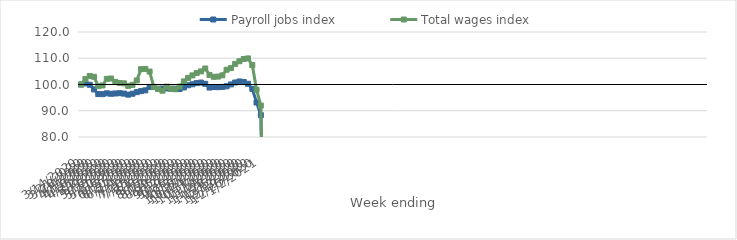
| Category | Payroll jobs index | Total wages index |
|---|---|---|
| 14/03/2020 | 100 | 100 |
| 21/03/2020 | 100.428 | 102.064 |
| 28/03/2020 | 99.907 | 103.228 |
| 04/04/2020 | 98.143 | 102.945 |
| 11/04/2020 | 96.362 | 99.372 |
| 18/04/2020 | 96.324 | 99.639 |
| 25/04/2020 | 96.643 | 102.149 |
| 02/05/2020 | 96.468 | 102.275 |
| 09/05/2020 | 96.583 | 101.01 |
| 16/05/2020 | 96.687 | 100.552 |
| 23/05/2020 | 96.527 | 100.441 |
| 30/05/2020 | 96.136 | 99.485 |
| 06/06/2020 | 96.486 | 99.864 |
| 13/06/2020 | 97.087 | 101.543 |
| 20/06/2020 | 97.475 | 105.837 |
| 27/06/2020 | 97.768 | 105.927 |
| 04/07/2020 | 99.079 | 104.925 |
| 11/07/2020 | 99.07 | 99.002 |
| 18/07/2020 | 98.41 | 98.271 |
| 25/07/2020 | 98.46 | 97.64 |
| 01/08/2020 | 98.492 | 99.183 |
| 08/08/2020 | 98.382 | 98.364 |
| 15/08/2020 | 98.414 | 98.197 |
| 22/08/2020 | 98.298 | 99.203 |
| 29/08/2020 | 98.865 | 101.172 |
| 05/09/2020 | 99.714 | 102.512 |
| 12/09/2020 | 100.088 | 103.469 |
| 19/09/2020 | 100.525 | 104.358 |
| 26/09/2020 | 100.741 | 105.005 |
| 03/10/2020 | 100.253 | 106.095 |
| 10/10/2020 | 98.836 | 103.66 |
| 17/10/2020 | 99.056 | 102.933 |
| 24/10/2020 | 98.981 | 103.017 |
| 31/10/2020 | 99.082 | 103.484 |
| 07/11/2020 | 99.325 | 105.622 |
| 14/11/2020 | 100.029 | 106.244 |
| 21/11/2020 | 100.774 | 107.868 |
| 28/11/2020 | 101.15 | 108.875 |
| 05/12/2020 | 100.96 | 109.722 |
| 12/12/2020 | 100.287 | 109.936 |
| 19/12/2020 | 98.348 | 107.402 |
| 26/12/2020 | 93.139 | 97.995 |
| 02/01/2021 | 88.324 | 91.975 |